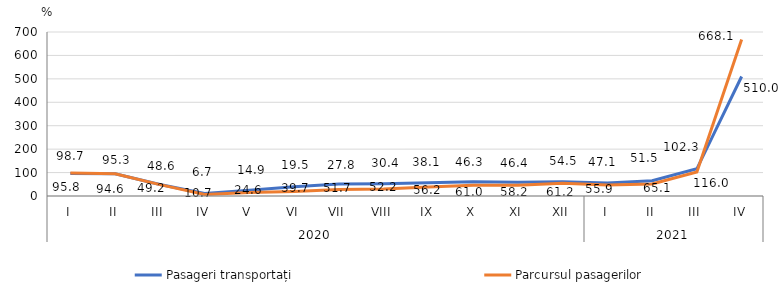
| Category | Pasageri transportați | Parcursul pasagerilor |
|---|---|---|
| 0 | 95.8 | 98.7 |
| 1 | 94.6 | 95.3 |
| 2 | 49.2 | 48.6 |
| 3 | 10.7 | 6.7 |
| 4 | 24.6 | 14.9 |
| 5 | 39.7 | 19.5 |
| 6 | 51.7 | 27.8 |
| 7 | 52.2 | 30.4 |
| 8 | 56.2 | 38.1 |
| 9 | 61 | 46.3 |
| 10 | 58.2 | 46.4 |
| 11 | 61.2 | 54.5 |
| 12 | 55.9 | 47.1 |
| 13 | 65.1 | 51.5 |
| 14 | 116 | 102.3 |
| 15 | 510 | 668.1 |